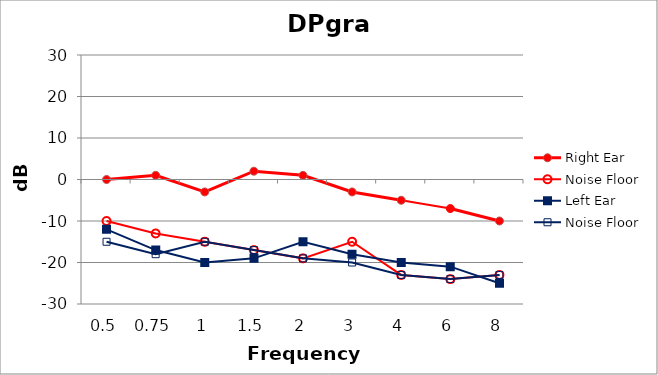
| Category | Right Ear | Noise Floor | Left Ear |
|---|---|---|---|
| 0.5 | 0 | -15 | -12 |
| 0.75 | 1 | -18 | -17 |
| 1.0 | -3 | -15 | -20 |
| 1.5 | 2 | -17 | -19 |
| 2.0 | 1 | -19 | -15 |
| 3.0 | -3 | -20 | -18 |
| 4.0 | -5 | -23 | -20 |
| 6.0 | -7 | -24 | -21 |
| 8.0 | -10 | -23 | -25 |